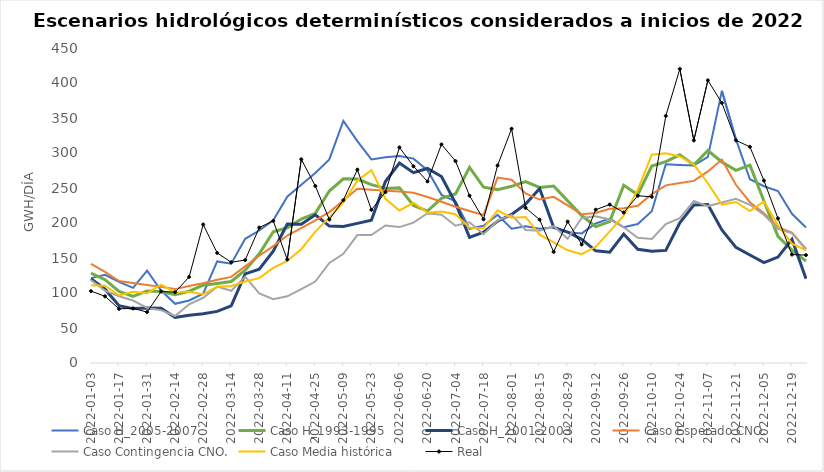
| Category | Caso H_2005-2007 | Caso H_1993-1995 | Caso H_2001-2003 | Caso Esperado CNO. | Caso Contingencia CNO. | Caso Media histórica | Real |
|---|---|---|---|---|---|---|---|
| 2022-01-03 | 121.274 | 128.353 | 120.283 | 141.636 | 118.417 | 111.193 | 102.68 |
| 2022-01-10 | 126.037 | 118.971 | 105.424 | 130.183 | 103.441 | 110.506 | 95.296 |
| 2022-01-17 | 115.77 | 102.299 | 81.99 | 117.029 | 95.379 | 96.427 | 77.385 |
| 2022-01-24 | 107.311 | 95.11 | 77.713 | 114.29 | 89.27 | 101.74 | 78.05 |
| 2022-01-31 | 131.867 | 102.944 | 78.396 | 111.327 | 78.766 | 99.673 | 72.742 |
| 2022-02-07 | 103.456 | 102.029 | 78.197 | 108.754 | 75.461 | 112.066 | 102.163 |
| 2022-02-14 | 84.597 | 97.624 | 64.99 | 105.564 | 67.117 | 100.774 | 101.157 |
| 2022-02-21 | 89.31 | 102.5 | 68.253 | 109.873 | 83.867 | 101.883 | 122.926 |
| 2022-02-28 | 99.071 | 111.146 | 70.413 | 113.807 | 93.177 | 98.384 | 197.88 |
| 2022-03-07 | 145.157 | 113.599 | 73.714 | 118.977 | 109.069 | 108.787 | 157.287 |
| 2022-03-14 | 141.874 | 116.463 | 81.616 | 123.047 | 103.123 | 109.926 | 143.866 |
| 2022-03-21 | 177.4 | 132.451 | 127.224 | 137.98 | 123.406 | 116.396 | 147.086 |
| 2022-03-28 | 189.271 | 156.086 | 133.869 | 153.257 | 99.521 | 121.189 | 193.454 |
| 2022-04-04 | 203.9 | 187.429 | 159.6 | 167.029 | 91.233 | 135.783 | 203.041 |
| 2022-04-11 | 237.686 | 193.143 | 198.386 | 182.143 | 95.234 | 145.871 | 147.81 |
| 2022-04-18 | 254.714 | 205.671 | 198.271 | 192.814 | 105.564 | 162.6 | 291.025 |
| 2022-04-25 | 271.414 | 213.7 | 211.743 | 203.9 | 116.29 | 187.671 | 252.873 |
| 2022-05-02 | 290.829 | 245.671 | 195.571 | 215.629 | 143 | 207.871 | 204.997 |
| 2022-05-09 | 345.857 | 263.129 | 195.171 | 232.114 | 155.986 | 229.343 | 232.682 |
| 2022-05-16 | 317 | 262.714 | 199.443 | 249 | 182.714 | 260.3 | 276.252 |
| 2022-05-23 | 290.886 | 254.729 | 203.829 | 247.514 | 182.714 | 275.571 | 218.854 |
| 2022-05-30 | 293.929 | 249.343 | 259.2 | 246.171 | 196.457 | 234.586 | 244.076 |
| 2022-06-06 | 295.857 | 250.171 | 285.729 | 245.171 | 194.143 | 217.929 | 307.959 |
| 2022-06-13 | 291.957 | 225.143 | 271.871 | 243.129 | 200.529 | 228.9 | 281.133 |
| 2022-06-20 | 275.443 | 216.986 | 277.886 | 237.057 | 213.914 | 214.771 | 259.437 |
| 2022-06-27 | 240.2 | 235.157 | 266.371 | 230.271 | 211.943 | 216.314 | 312.284 |
| 2022-07-04 | 230.8 | 241.529 | 228.4 | 223.143 | 196.186 | 212.614 | 288.463 |
| 2022-07-11 | 191.729 | 279.429 | 179.457 | 217.243 | 201.043 | 193.343 | 239.006 |
| 2022-07-18 | 196 | 251.243 | 186.814 | 211.543 | 184.014 | 192.486 | 205.304 |
| 2022-07-25 | 211.814 | 247.714 | 202.6 | 264.871 | 203.4 | 218.071 | 282.174 |
| 2022-08-01 | 191.757 | 252.414 | 212.371 | 261.714 | 211.686 | 207.671 | 334.578 |
| 2022-08-08 | 195.229 | 259 | 227 | 242.357 | 189.986 | 208.586 | 221.613 |
| 2022-08-15 | 191.857 | 250.729 | 249.257 | 233.457 | 189 | 183.4 | 204.827 |
| 2022-08-22 | 193.929 | 252.757 | 193.843 | 237.414 | 195.4 | 172.271 | 158.732 |
| 2022-08-29 | 186.671 | 231.586 | 187.129 | 225.071 | 177.357 | 161.014 | 201.99 |
| 2022-09-05 | 185.157 | 210.643 | 176.629 | 212.457 | 207.186 | 155.557 | 169.347 |
| 2022-09-12 | 199.371 | 194.771 | 160.214 | 214.257 | 209.686 | 165.971 | 219.028 |
| 2022-09-19 | 206.257 | 202.057 | 158.171 | 220.314 | 205.014 | 188.043 | 226.343 |
| 2022-09-26 | 193.871 | 253.9 | 184.214 | 220.986 | 193.829 | 210.414 | 215.001 |
| 2022-10-03 | 198.486 | 240.429 | 162.414 | 224.529 | 178.8 | 247.414 | 238.947 |
| 2022-10-10 | 216.757 | 281.3 | 159.7 | 241.214 | 177.143 | 297.5 | 237.41 |
| 2022-10-17 | 283.814 | 287.743 | 160.857 | 253.743 | 198.471 | 299.486 | 352.982 |
| 2022-10-24 | 282.943 | 297.371 | 200.1 | 256.986 | 206.8 | 295.014 | 420.028 |
| 2022-10-31 | 282.014 | 282.971 | 225.629 | 260.143 | 231.5 | 283.714 | 317.99 |
| 2022-11-07 | 294.414 | 303.543 | 226.457 | 273.686 | 224.171 | 256.786 | 403.777 |
| 2022-11-14 | 388.8 | 287.214 | 190.186 | 290.743 | 229.243 | 226.286 | 371.55 |
| 2022-11-21 | 319.714 | 275.257 | 165.143 | 254.571 | 234.6 | 230.086 | 318.115 |
| 2022-11-28 | 262.5 | 282.571 | 154.3 | 229.643 | 226.057 | 217.014 | 308.815 |
| 2022-12-05 | 252.557 | 231.514 | 143.386 | 213.929 | 211.771 | 230.671 | 260.622 |
| 2022-12-12 | 245.757 | 180.929 | 151.286 | 194.014 | 191.743 | 196.686 | 206.546 |
| 2022-12-19 | 213.171 | 161.186 | 176.829 | 186.414 | 185.414 | 170.457 | 154.953 |
| 2022-12-26 | 193.529 | 145.586 | 120.476 | 162.986 | 161.6 | 160.757 | 154.123 |